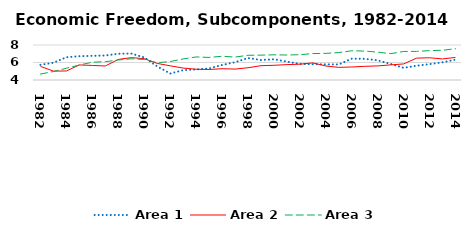
| Category | Area 1 | Area 2 | Area 3 |
|---|---|---|---|
| 1982.0 | 5.734 | 5.555 | 4.68 |
| 1983.0 | 5.971 | 5.016 | 4.972 |
| 1984.0 | 6.604 | 5.034 | 5.346 |
| 1985.0 | 6.722 | 5.722 | 5.714 |
| 1986.0 | 6.76 | 5.661 | 6.032 |
| 1987.0 | 6.8 | 5.604 | 6.092 |
| 1988.0 | 7.001 | 6.35 | 6.288 |
| 1989.0 | 7.024 | 6.557 | 6.421 |
| 1990.0 | 6.577 | 6.437 | 6.347 |
| 1991.0 | 5.557 | 5.896 | 5.978 |
| 1992.0 | 4.734 | 5.622 | 6.109 |
| 1993.0 | 5.123 | 5.363 | 6.405 |
| 1994.0 | 5.209 | 5.227 | 6.636 |
| 1995.0 | 5.323 | 5.201 | 6.579 |
| 1996.0 | 5.715 | 5.292 | 6.718 |
| 1997.0 | 6.033 | 5.247 | 6.619 |
| 1998.0 | 6.513 | 5.403 | 6.825 |
| 1999.0 | 6.287 | 5.636 | 6.842 |
| 2000.0 | 6.368 | 5.682 | 6.878 |
| 2001.0 | 6.101 | 5.758 | 6.855 |
| 2002.0 | 5.834 | 5.808 | 6.891 |
| 2003.0 | 5.811 | 5.955 | 7.021 |
| 2004.0 | 5.787 | 5.603 | 7.043 |
| 2005.0 | 5.779 | 5.444 | 7.138 |
| 2006.0 | 6.44 | 5.486 | 7.34 |
| 2007.0 | 6.423 | 5.561 | 7.304 |
| 2008.0 | 6.251 | 5.612 | 7.184 |
| 2009.0 | 5.835 | 5.727 | 7.01 |
| 2010.0 | 5.388 | 5.836 | 7.26 |
| 2011.0 | 5.632 | 6.501 | 7.269 |
| 2012.0 | 5.812 | 6.54 | 7.36 |
| 2013.0 | 6.024 | 6.408 | 7.4 |
| 2014.0 | 6.325 | 6.579 | 7.573 |